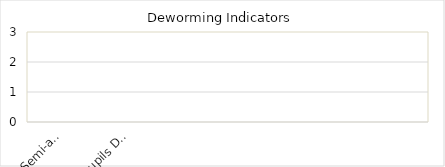
| Category | Series 0 |
|---|---|
| Semi-annual Deworming | 0 |
| Pupils Dewormed | 0 |